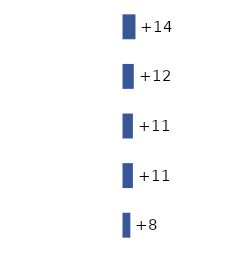
| Category | Series 0 |
|---|---|
| 0 | 14 |
| 1 | 12 |
| 2 | 11 |
| 3 | 11 |
| 4 | 8 |